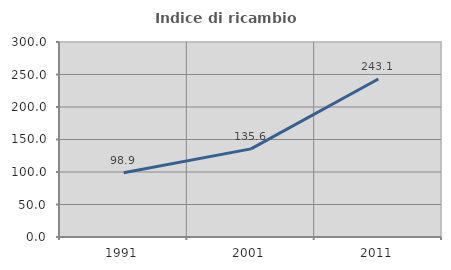
| Category | Indice di ricambio occupazionale  |
|---|---|
| 1991.0 | 98.889 |
| 2001.0 | 135.616 |
| 2011.0 | 243.103 |